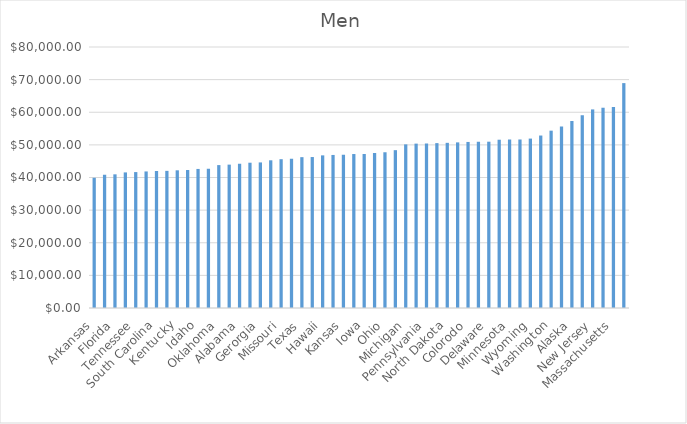
| Category | Men |
|---|---|
| Arkansas | 39916 |
| Mississippi | 40850 |
| Florida | 40971 |
| New Mexico | 41561 |
| Tennessee | 41661 |
| North Carolina | 41857 |
| South Carolina | 41991 |
| South Dakota | 42034 |
| Kentucky | 42203 |
| Nevada | 42294 |
| Idaho | 42624 |
| Montana | 42679 |
| Oklahoma | 43803 |
| Arizona | 43945 |
| Alabama | 44245 |
| Nebraska | 44533 |
| Gerorgia | 44623 |
| West Virginia | 45272 |
| Missouri | 45611 |
| Maine | 45784 |
| Texas | 46235 |
| Indiana | 46273 |
| Hawaii | 46786 |
| Vermont | 46911 |
| Kansas | 46951 |
| Oregon | 47194 |
| Iowa | 47202 |
| Wisconsin | 47518 |
| Ohio | 47737 |
| Louisiana | 48382 |
| Michigan | 50157 |
| United States | 50383 |
| Pennsylvania | 50412 |
| California | 50539 |
| North Dakota | 50624 |
| Rhode Island | 50765 |
| Colorodo | 50898 |
| Utah | 50937 |
| Delaware | 50976 |
| New York | 51580 |
| Minnesota | 51625 |
| Illinois | 51652 |
| Wyoming | 51926 |
| Virginia | 52864 |
| Washington | 54358 |
| New Hampshire | 55617 |
| Alaska | 57318 |
| Maryland | 59085 |
| New Jersey | 60870 |
| Connecticut | 61385 |
| Massachusetts | 61611 |
| District of Columbia | 68932 |